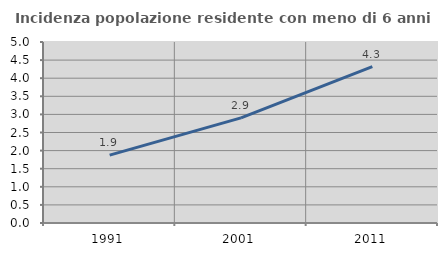
| Category | Incidenza popolazione residente con meno di 6 anni |
|---|---|
| 1991.0 | 1.875 |
| 2001.0 | 2.903 |
| 2011.0 | 4.319 |